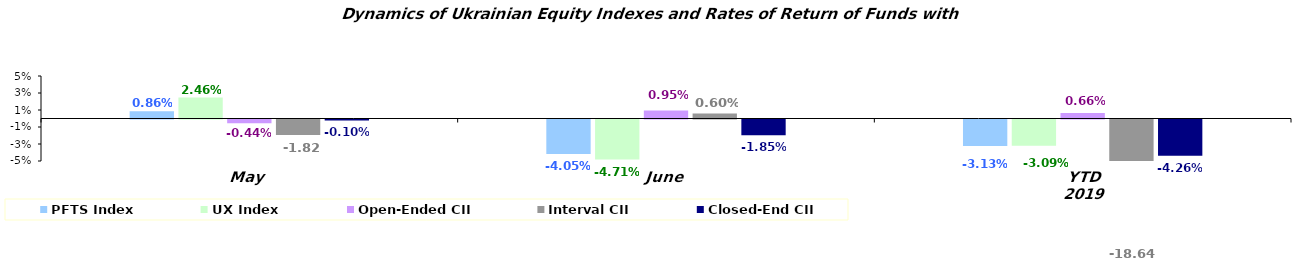
| Category | PFTS Index | UX Index | Open-Ended CII | Interval CII | Closed-End CII |
|---|---|---|---|---|---|
| May | 0.009 | 0.025 | -0.004 | -0.018 | -0.001 |
| June | -0.041 | -0.047 | 0.01 | 0.006 | -0.019 |
| YTD 2019 | -0.031 | -0.031 | 0.007 | -0.186 | -0.043 |